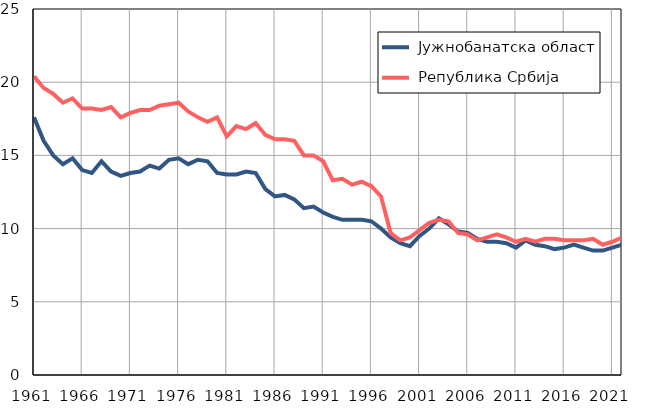
| Category |  Јужнобанатска област |  Република Србија |
|---|---|---|
| 1961.0 | 17.6 | 20.4 |
| 1962.0 | 16 | 19.6 |
| 1963.0 | 15 | 19.2 |
| 1964.0 | 14.4 | 18.6 |
| 1965.0 | 14.8 | 18.9 |
| 1966.0 | 14 | 18.2 |
| 1967.0 | 13.8 | 18.2 |
| 1968.0 | 14.6 | 18.1 |
| 1969.0 | 13.9 | 18.3 |
| 1970.0 | 13.6 | 17.6 |
| 1971.0 | 13.8 | 17.9 |
| 1972.0 | 13.9 | 18.1 |
| 1973.0 | 14.3 | 18.1 |
| 1974.0 | 14.1 | 18.4 |
| 1975.0 | 14.7 | 18.5 |
| 1976.0 | 14.8 | 18.6 |
| 1977.0 | 14.4 | 18 |
| 1978.0 | 14.7 | 17.6 |
| 1979.0 | 14.6 | 17.3 |
| 1980.0 | 13.8 | 17.6 |
| 1981.0 | 13.7 | 16.3 |
| 1982.0 | 13.7 | 17 |
| 1983.0 | 13.9 | 16.8 |
| 1984.0 | 13.8 | 17.2 |
| 1985.0 | 12.7 | 16.4 |
| 1986.0 | 12.2 | 16.1 |
| 1987.0 | 12.3 | 16.1 |
| 1988.0 | 12 | 16 |
| 1989.0 | 11.4 | 15 |
| 1990.0 | 11.5 | 15 |
| 1991.0 | 11.1 | 14.6 |
| 1992.0 | 10.8 | 13.3 |
| 1993.0 | 10.6 | 13.4 |
| 1994.0 | 10.6 | 13 |
| 1995.0 | 10.6 | 13.2 |
| 1996.0 | 10.5 | 12.9 |
| 1997.0 | 10 | 12.2 |
| 1998.0 | 9.4 | 9.7 |
| 1999.0 | 9 | 9.2 |
| 2000.0 | 8.8 | 9.4 |
| 2001.0 | 9.5 | 9.9 |
| 2002.0 | 10 | 10.4 |
| 2003.0 | 10.7 | 10.6 |
| 2004.0 | 10.3 | 10.5 |
| 2005.0 | 9.8 | 9.7 |
| 2006.0 | 9.7 | 9.6 |
| 2007.0 | 9.3 | 9.2 |
| 2008.0 | 9.1 | 9.4 |
| 2009.0 | 9.1 | 9.6 |
| 2010.0 | 9 | 9.4 |
| 2011.0 | 8.7 | 9.1 |
| 2012.0 | 9.2 | 9.3 |
| 2013.0 | 8.9 | 9.1 |
| 2014.0 | 8.8 | 9.3 |
| 2015.0 | 8.6 | 9.3 |
| 2016.0 | 8.7 | 9.2 |
| 2017.0 | 8.9 | 9.2 |
| 2018.0 | 8.7 | 9.2 |
| 2019.0 | 8.5 | 9.3 |
| 2020.0 | 8.5 | 8.9 |
| 2021.0 | 8.7 | 9.1 |
| 2022.0 | 8.9 | 9.4 |